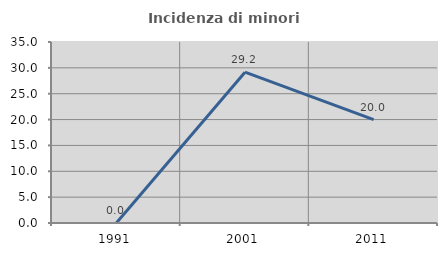
| Category | Incidenza di minori stranieri |
|---|---|
| 1991.0 | 0 |
| 2001.0 | 29.167 |
| 2011.0 | 20 |